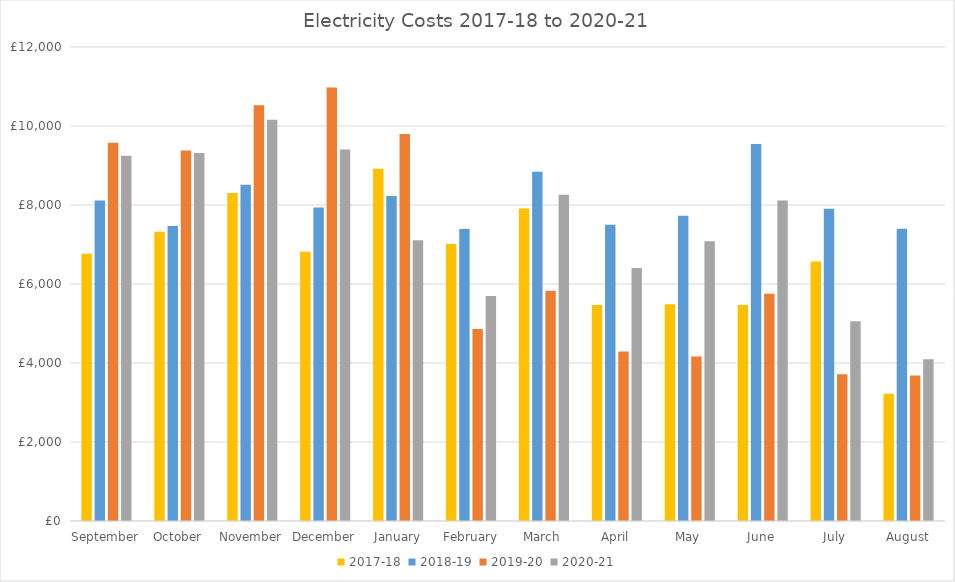
| Category | 2017-18 | 2018-19 | 2019-20 | 2020-21 |
|---|---|---|---|---|
| September  | 6766.82 | 8116.09 | 9574.05 | 9244 |
| October | 7322.2 | 7467.75 | 9380 | 9314 |
| November | 8303.17 | 8513.12 | 10523.74 | 10158 |
| December | 6816.47 | 7938.87 | 10972 | 9403 |
| January | 8915.93 | 8228.64 | 9799 | 7106 |
| February | 7011.57 | 7390.54 | 4861 | 5699 |
| March | 7913.2 | 8843.11 | 5827 | 8260 |
| April | 5470.63 | 7501.71 | 4288 | 6402 |
| May | 5485 | 7729.5 | 4167 | 7083 |
| June | 5466.39 | 9542.75 | 5753 | 8117 |
| July | 6569.74 | 7904 | 3716 | 5056 |
| August | 3223.86 | 7398.09 | 3681 | 4092 |